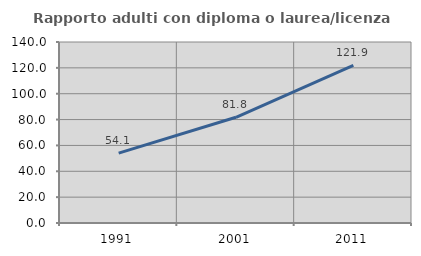
| Category | Rapporto adulti con diploma o laurea/licenza media  |
|---|---|
| 1991.0 | 54.054 |
| 2001.0 | 81.788 |
| 2011.0 | 121.85 |